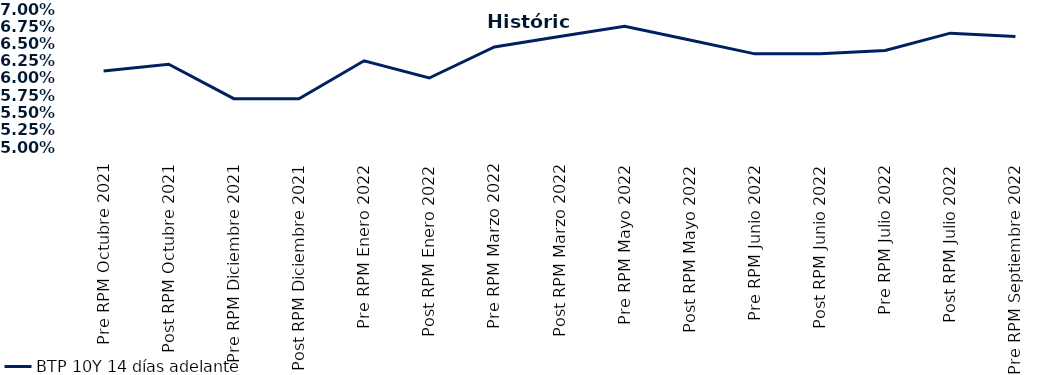
| Category | BTP 10Y 14 días adelante |
|---|---|
| Pre RPM Octubre 2021 | 0.061 |
| Post RPM Octubre 2021 | 0.062 |
| Pre RPM Diciembre 2021 | 0.057 |
| Post RPM Diciembre 2021 | 0.057 |
| Pre RPM Enero 2022 | 0.062 |
| Post RPM Enero 2022 | 0.06 |
| Pre RPM Marzo 2022 | 0.064 |
| Post RPM Marzo 2022 | 0.066 |
| Pre RPM Mayo 2022 | 0.068 |
| Post RPM Mayo 2022 | 0.066 |
| Pre RPM Junio 2022 | 0.064 |
| Post RPM Junio 2022 | 0.064 |
| Pre RPM Julio 2022 | 0.064 |
| Post RPM Julio 2022 | 0.066 |
| Pre RPM Septiembre 2022 | 0.066 |